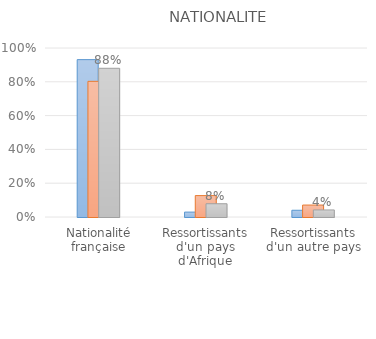
| Category | Ensemble de la population | Ensemble des mis en cause | Mis en cause pour crime ou délit à caractère raciste, xénophobe ou antireligieux |
|---|---|---|---|
| Nationalité française | 0.931 | 0.803 | 0.88 |
| Ressortissants d'un pays d'Afrique | 0.029 | 0.127 | 0.078 |
| Ressortissants d'un autre pays | 0.04 | 0.071 | 0.042 |